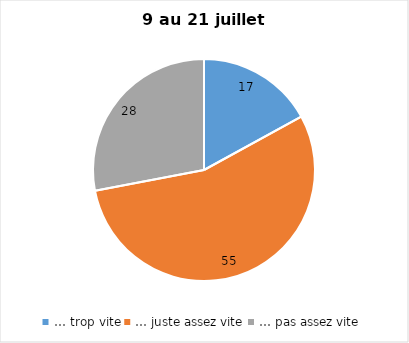
| Category | Series 0 |
|---|---|
| … trop vite | 17 |
| … juste assez vite | 55 |
| … pas assez vite | 28 |